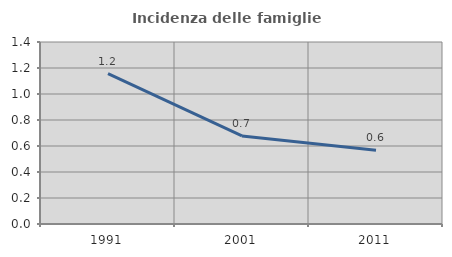
| Category | Incidenza delle famiglie numerose |
|---|---|
| 1991.0 | 1.157 |
| 2001.0 | 0.677 |
| 2011.0 | 0.567 |